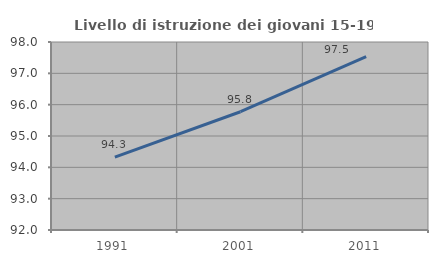
| Category | Livello di istruzione dei giovani 15-19 anni |
|---|---|
| 1991.0 | 94.326 |
| 2001.0 | 95.775 |
| 2011.0 | 97.531 |